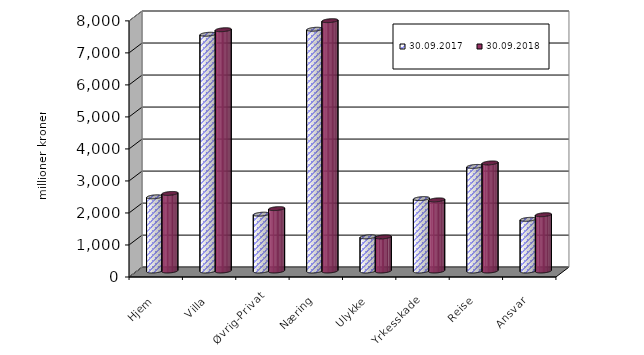
| Category | 30.09.2017 | 30.09.2018 |
|---|---|---|
| Hjem | 2317.157 | 2422.602 |
| Villa | 7394.691 | 7536.343 |
| Øvrig-Privat | 1775.037 | 1948.86 |
| Næring | 7550.894 | 7819.129 |
| Ulykke | 1067.202 | 1064.267 |
| Yrkesskade | 2261.757 | 2221.173 |
| Reise | 3266.26 | 3375.772 |
| Ansvar | 1613.817 | 1758.197 |